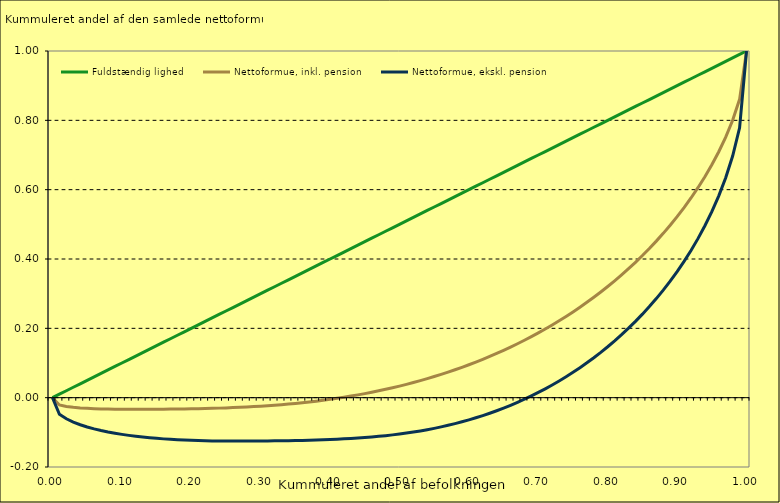
| Category | Fuldstændig lighed | Nettoformue, inkl. pension | Nettoformue, ekskl. pension |
|---|---|---|---|
| 0.0 | 0 | 0 | 0 |
| 0.01 | 0.01 | -0.021 | -0.048 |
| 0.02 | 0.02 | -0.025 | -0.061 |
| 0.03 | 0.03 | -0.028 | -0.071 |
| 0.04 | 0.04 | -0.029 | -0.078 |
| 0.05 | 0.05 | -0.031 | -0.085 |
| 0.06 | 0.06 | -0.032 | -0.09 |
| 0.07 | 0.07 | -0.032 | -0.095 |
| 0.08 | 0.08 | -0.033 | -0.099 |
| 0.09 | 0.09 | -0.033 | -0.103 |
| 0.1 | 0.1 | -0.033 | -0.106 |
| 0.11 | 0.11 | -0.033 | -0.109 |
| 0.12 | 0.12 | -0.033 | -0.111 |
| 0.13 | 0.13 | -0.033 | -0.114 |
| 0.14 | 0.14 | -0.033 | -0.116 |
| 0.15 | 0.15 | -0.033 | -0.117 |
| 0.16 | 0.16 | -0.033 | -0.119 |
| 0.17 | 0.17 | -0.033 | -0.12 |
| 0.18 | 0.18 | -0.033 | -0.121 |
| 0.19 | 0.19 | -0.033 | -0.122 |
| 0.2 | 0.2 | -0.032 | -0.123 |
| 0.21 | 0.21 | -0.032 | -0.124 |
| 0.22 | 0.22 | -0.031 | -0.124 |
| 0.23 | 0.23 | -0.031 | -0.125 |
| 0.24 | 0.24 | -0.03 | -0.125 |
| 0.25 | 0.25 | -0.029 | -0.125 |
| 0.26 | 0.26 | -0.029 | -0.125 |
| 0.27 | 0.27 | -0.028 | -0.125 |
| 0.28 | 0.28 | -0.027 | -0.125 |
| 0.29 | 0.29 | -0.026 | -0.125 |
| 0.3 | 0.3 | -0.025 | -0.125 |
| 0.31 | 0.31 | -0.023 | -0.125 |
| 0.32 | 0.32 | -0.022 | -0.125 |
| 0.33 | 0.33 | -0.02 | -0.124 |
| 0.34 | 0.34 | -0.019 | -0.124 |
| 0.35 | 0.35 | -0.017 | -0.124 |
| 0.36 | 0.36 | -0.015 | -0.123 |
| 0.37 | 0.37 | -0.012 | -0.123 |
| 0.38 | 0.38 | -0.01 | -0.122 |
| 0.39 | 0.39 | -0.007 | -0.121 |
| 0.4 | 0.4 | -0.005 | -0.121 |
| 0.41 | 0.41 | -0.002 | -0.12 |
| 0.42 | 0.42 | 0.001 | -0.119 |
| 0.43 | 0.43 | 0.005 | -0.118 |
| 0.44 | 0.44 | 0.008 | -0.116 |
| 0.45 | 0.45 | 0.012 | -0.115 |
| 0.46 | 0.46 | 0.016 | -0.113 |
| 0.47 | 0.47 | 0.02 | -0.112 |
| 0.48 | 0.48 | 0.024 | -0.11 |
| 0.49 | 0.49 | 0.029 | -0.107 |
| 0.5 | 0.5 | 0.033 | -0.105 |
| 0.51 | 0.51 | 0.038 | -0.102 |
| 0.52 | 0.52 | 0.044 | -0.099 |
| 0.53 | 0.53 | 0.049 | -0.096 |
| 0.54 | 0.54 | 0.055 | -0.092 |
| 0.55 | 0.55 | 0.061 | -0.089 |
| 0.56 | 0.56 | 0.067 | -0.084 |
| 0.57 | 0.57 | 0.074 | -0.08 |
| 0.58 | 0.58 | 0.081 | -0.075 |
| 0.59 | 0.59 | 0.088 | -0.07 |
| 0.6 | 0.6 | 0.095 | -0.064 |
| 0.61 | 0.61 | 0.103 | -0.058 |
| 0.62 | 0.62 | 0.111 | -0.052 |
| 0.63 | 0.63 | 0.119 | -0.045 |
| 0.64 | 0.64 | 0.128 | -0.038 |
| 0.65 | 0.65 | 0.137 | -0.03 |
| 0.66 | 0.66 | 0.146 | -0.022 |
| 0.67 | 0.67 | 0.156 | -0.013 |
| 0.68 | 0.68 | 0.166 | -0.004 |
| 0.69 | 0.69 | 0.176 | 0.005 |
| 0.7 | 0.7 | 0.187 | 0.015 |
| 0.71 | 0.71 | 0.198 | 0.026 |
| 0.72 | 0.72 | 0.21 | 0.037 |
| 0.73 | 0.73 | 0.222 | 0.048 |
| 0.74 | 0.74 | 0.234 | 0.06 |
| 0.75 | 0.75 | 0.247 | 0.073 |
| 0.76 | 0.76 | 0.261 | 0.087 |
| 0.77 | 0.77 | 0.275 | 0.101 |
| 0.78 | 0.78 | 0.29 | 0.115 |
| 0.79 | 0.79 | 0.305 | 0.131 |
| 0.8 | 0.8 | 0.321 | 0.147 |
| 0.81 | 0.81 | 0.337 | 0.164 |
| 0.82 | 0.82 | 0.354 | 0.182 |
| 0.83 | 0.83 | 0.372 | 0.2 |
| 0.84 | 0.84 | 0.391 | 0.22 |
| 0.85 | 0.85 | 0.41 | 0.241 |
| 0.86 | 0.86 | 0.43 | 0.263 |
| 0.87 | 0.87 | 0.452 | 0.286 |
| 0.88 | 0.88 | 0.474 | 0.31 |
| 0.89 | 0.89 | 0.497 | 0.336 |
| 0.9 | 0.9 | 0.522 | 0.364 |
| 0.91 | 0.91 | 0.548 | 0.393 |
| 0.92 | 0.92 | 0.576 | 0.425 |
| 0.93 | 0.93 | 0.606 | 0.459 |
| 0.94 | 0.94 | 0.637 | 0.496 |
| 0.95 | 0.95 | 0.672 | 0.537 |
| 0.96 | 0.96 | 0.709 | 0.582 |
| 0.97 | 0.97 | 0.752 | 0.635 |
| 0.98 | 0.98 | 0.8 | 0.697 |
| 0.99 | 0.99 | 0.861 | 0.779 |
| 1.0 | 1 | 1 | 1 |